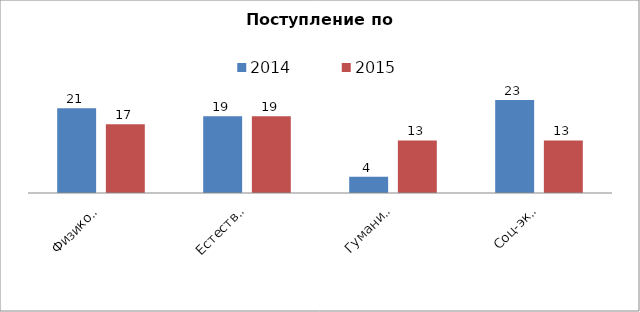
| Category | 2014 | 2015 |
|---|---|---|
| Физико-математическое | 21 | 17 |
| Естественно-научное | 19 | 19 |
| Гуманитарное | 4 | 13 |
| Соц-экономическое | 23 | 13 |